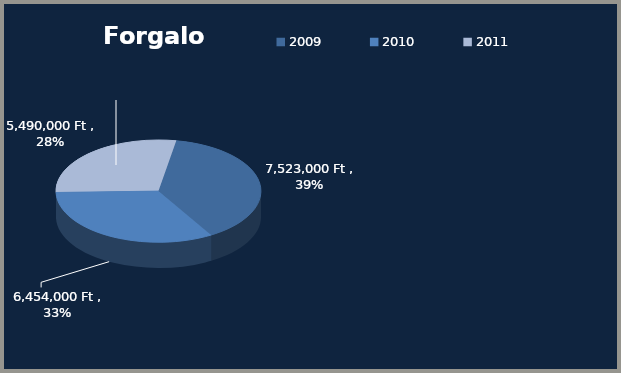
| Category | Series 12 |
|---|---|
| 2009 | 7523000 |
| 2010 | 6454000 |
| 2011 | 5490000 |